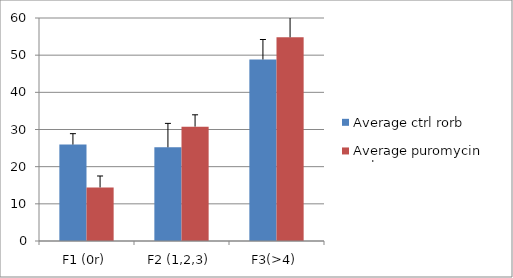
| Category | Average ctrl rorb | Average puromycin  rorb  |
|---|---|---|
| F1 (0r) | 25.946 | 14.42 |
| F2 (1,2,3) | 25.214 | 30.77 |
| F3(>4) | 48.84 | 54.81 |